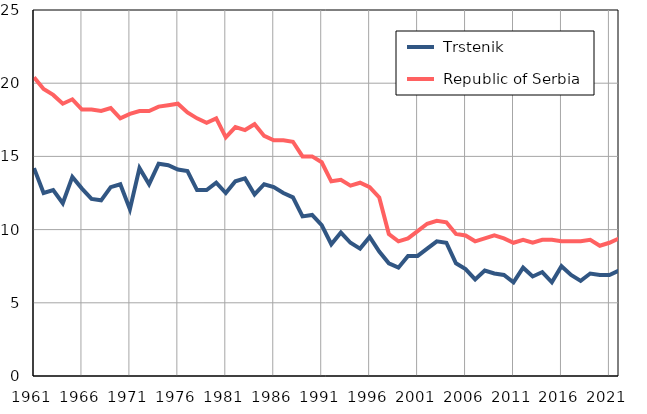
| Category |  Trstenik |  Republic of Serbia |
|---|---|---|
| 1961.0 | 14.2 | 20.4 |
| 1962.0 | 12.5 | 19.6 |
| 1963.0 | 12.7 | 19.2 |
| 1964.0 | 11.8 | 18.6 |
| 1965.0 | 13.6 | 18.9 |
| 1966.0 | 12.8 | 18.2 |
| 1967.0 | 12.1 | 18.2 |
| 1968.0 | 12 | 18.1 |
| 1969.0 | 12.9 | 18.3 |
| 1970.0 | 13.1 | 17.6 |
| 1971.0 | 11.4 | 17.9 |
| 1972.0 | 14.2 | 18.1 |
| 1973.0 | 13.1 | 18.1 |
| 1974.0 | 14.5 | 18.4 |
| 1975.0 | 14.4 | 18.5 |
| 1976.0 | 14.1 | 18.6 |
| 1977.0 | 14 | 18 |
| 1978.0 | 12.7 | 17.6 |
| 1979.0 | 12.7 | 17.3 |
| 1980.0 | 13.2 | 17.6 |
| 1981.0 | 12.5 | 16.3 |
| 1982.0 | 13.3 | 17 |
| 1983.0 | 13.5 | 16.8 |
| 1984.0 | 12.4 | 17.2 |
| 1985.0 | 13.1 | 16.4 |
| 1986.0 | 12.9 | 16.1 |
| 1987.0 | 12.5 | 16.1 |
| 1988.0 | 12.2 | 16 |
| 1989.0 | 10.9 | 15 |
| 1990.0 | 11 | 15 |
| 1991.0 | 10.3 | 14.6 |
| 1992.0 | 9 | 13.3 |
| 1993.0 | 9.8 | 13.4 |
| 1994.0 | 9.1 | 13 |
| 1995.0 | 8.7 | 13.2 |
| 1996.0 | 9.5 | 12.9 |
| 1997.0 | 8.5 | 12.2 |
| 1998.0 | 7.7 | 9.7 |
| 1999.0 | 7.4 | 9.2 |
| 2000.0 | 8.2 | 9.4 |
| 2001.0 | 8.2 | 9.9 |
| 2002.0 | 8.7 | 10.4 |
| 2003.0 | 9.2 | 10.6 |
| 2004.0 | 9.1 | 10.5 |
| 2005.0 | 7.7 | 9.7 |
| 2006.0 | 7.3 | 9.6 |
| 2007.0 | 6.6 | 9.2 |
| 2008.0 | 7.2 | 9.4 |
| 2009.0 | 7 | 9.6 |
| 2010.0 | 6.9 | 9.4 |
| 2011.0 | 6.4 | 9.1 |
| 2012.0 | 7.4 | 9.3 |
| 2013.0 | 6.8 | 9.1 |
| 2014.0 | 7.1 | 9.3 |
| 2015.0 | 6.4 | 9.3 |
| 2016.0 | 7.5 | 9.2 |
| 2017.0 | 6.9 | 9.2 |
| 2018.0 | 6.5 | 9.2 |
| 2019.0 | 7 | 9.3 |
| 2020.0 | 6.9 | 8.9 |
| 2021.0 | 6.9 | 9.1 |
| 2022.0 | 7.2 | 9.4 |